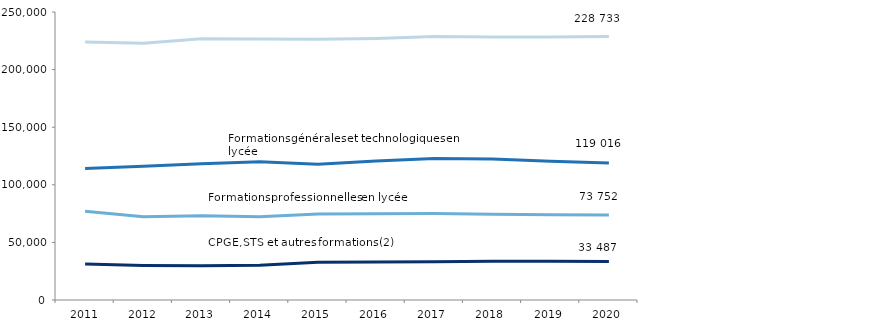
| Category | Formations en collège y compris Segpa | Formations professionnelles au lycée | Formations générales et technologiques en lycée | CPGE, STS et autres formations (2) |
|---|---|---|---|---|
| 2011
 | 224018 | 77077 | 114209 | 31157 |
| 2012
 | 222896 | 72238 | 116019 | 30007 |
| 2013 | 226870 | 73197 | 118365 | 29838 |
| 2014 | 226567 | 72261 | 120064 | 30165 |
| 2015 | 226285 | 74598 | 117927 | 32830 |
| 2016 | 227021 | 74766 | 120684 | 32923 |
| 2017 | 228751 | 75131 | 122838 | 33163 |
| 2018 | 228334.5 | 74504.3 | 122477.2 | 33664.28 |
| 2019 | 228328 | 74046 | 120377 | 33641 |
| 2020 | 228733 | 73752 | 119016 | 33487 |